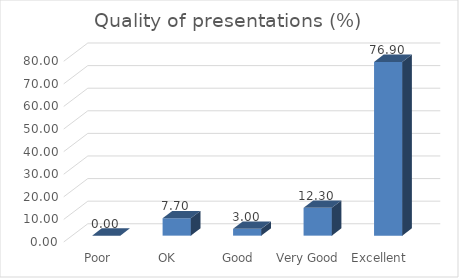
| Category | Quality of presentations (%) |
|---|---|
| Poor | 0 |
| OK | 7.7 |
| Good | 3 |
| Very Good | 12.3 |
| Excellent | 76.9 |